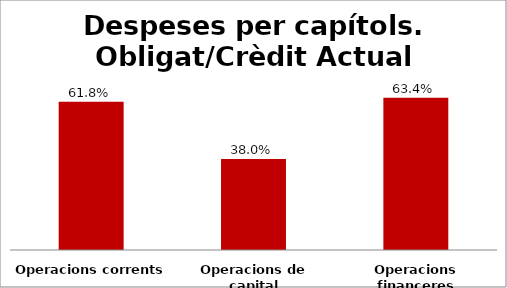
| Category | Series 0 |
|---|---|
| Operacions corrents | 0.618 |
| Operacions de capital | 0.38 |
| Operacions financeres | 0.634 |